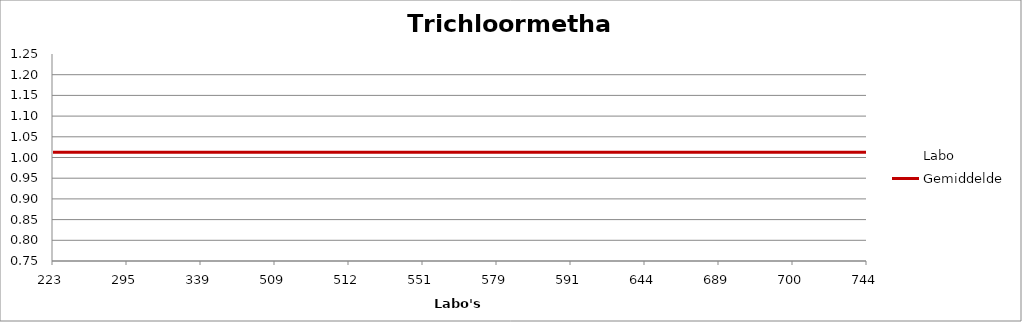
| Category | Labo | Gemiddelde |
|---|---|---|
| 223.0 | 1.031 | 1.012 |
| 295.0 | 0.961 | 1.012 |
| 339.0 | 1.163 | 1.012 |
| 509.0 | 0.872 | 1.012 |
| 512.0 | 0 | 1.012 |
| 551.0 | 1.222 | 1.012 |
| 579.0 | 0.953 | 1.012 |
| 591.0 | 1.047 | 1.012 |
| 644.0 | 0.988 | 1.012 |
| 689.0 | 0.984 | 1.012 |
| 700.0 | 1.07 | 1.012 |
| 744.0 | 0.883 | 1.012 |